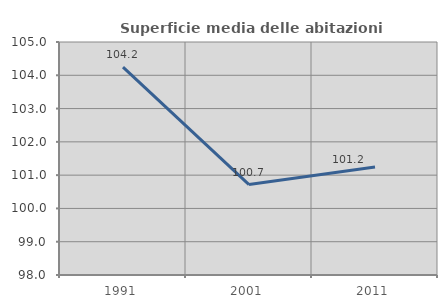
| Category | Superficie media delle abitazioni occupate |
|---|---|
| 1991.0 | 104.248 |
| 2001.0 | 100.717 |
| 2011.0 | 101.243 |